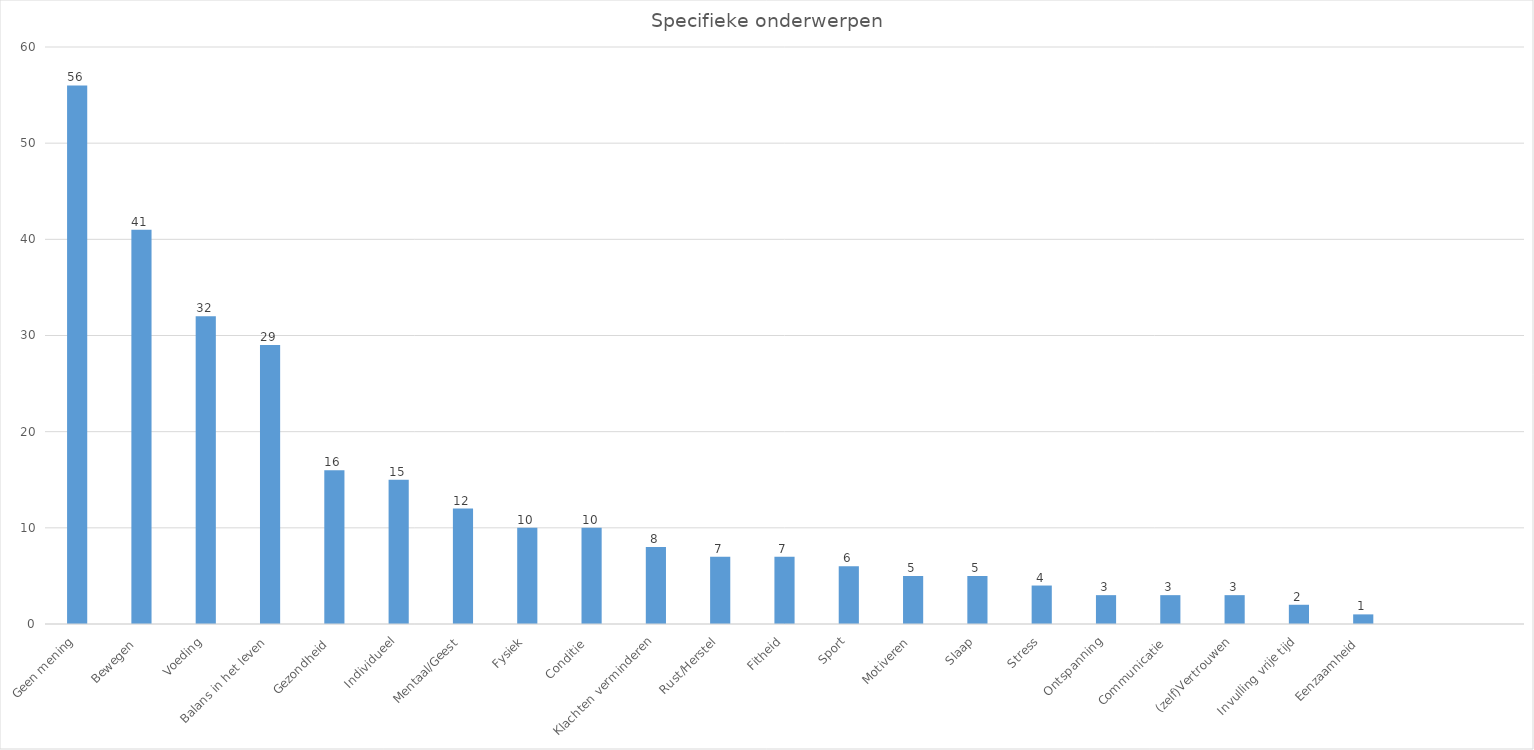
| Category | Series 0 |
|---|---|
| Geen mening | 56 |
| Bewegen  | 41 |
| Voeding | 32 |
| Balans in het leven | 29 |
| Gezondheid  | 16 |
| Individueel | 15 |
| Mentaal/Geest | 12 |
| Fysiek | 10 |
| Conditie  | 10 |
| Klachten verminderen | 8 |
| Rust/Herstel | 7 |
| Fitheid | 7 |
| Sport | 6 |
| Motiveren | 5 |
| Slaap | 5 |
| Stress | 4 |
| Ontspanning | 3 |
| Communicatie  | 3 |
| (zelf)Vertrouwen | 3 |
| Invulling vrije tijd | 2 |
| Eenzaamheid  | 1 |